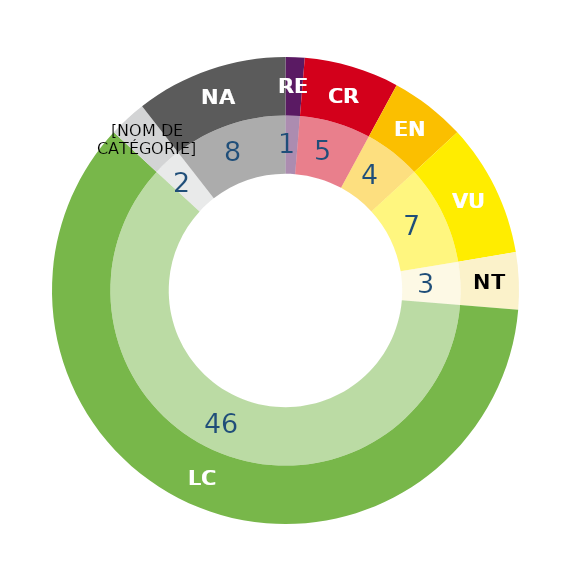
| Category | Series 1 | Series 0 |
|---|---|---|
| RE | 1 | 1 |
| CR | 5 | 5 |
| EN | 4 | 4 |
| VU | 7 | 7 |
| NT | 3 | 3 |
| LC | 46 | 46 |
| DD | 2 | 2 |
| NA | 8 | 8 |